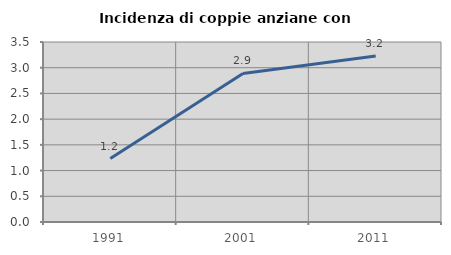
| Category | Incidenza di coppie anziane con figli |
|---|---|
| 1991.0 | 1.235 |
| 2001.0 | 2.889 |
| 2011.0 | 3.226 |